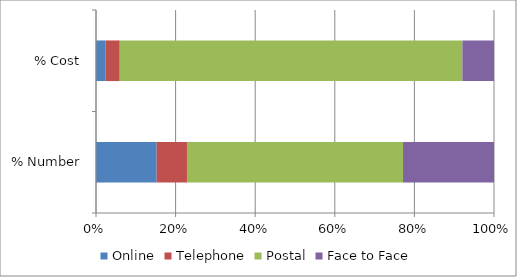
| Category | Online | Telephone | Postal | Face to Face |
|---|---|---|---|---|
| % Number | 0.152 | 0.076 | 0.543 | 0.229 |
| % Cost | 0.024 | 0.036 | 0.861 | 0.079 |